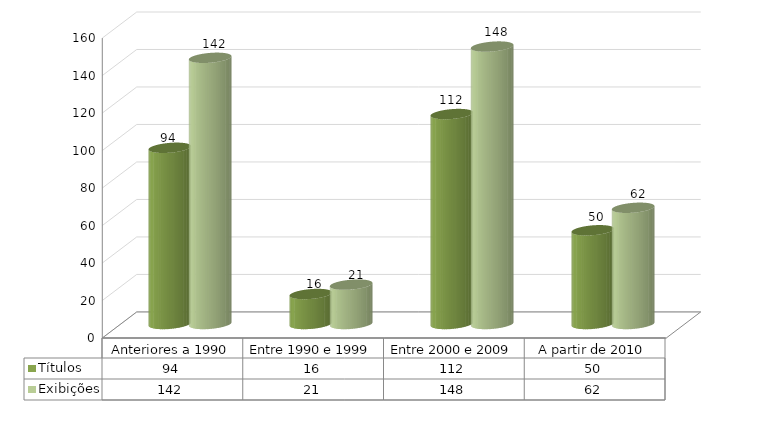
| Category | Títulos | Exibições |
|---|---|---|
| Anteriores a 1990 | 94 | 142 |
| Entre 1990 e 1999 | 16 | 21 |
| Entre 2000 e 2009 | 112 | 148 |
| A partir de 2010 | 50 | 62 |